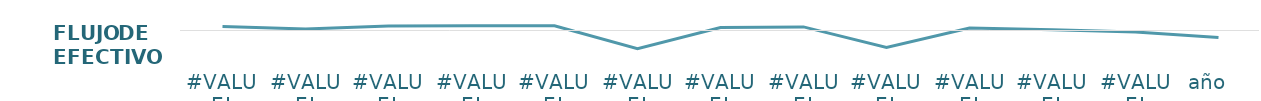
| Category | Flujo de efectivo |
|---|---|
| #VALUE! | 169 |
| #VALUE! | 69 |
| #VALUE! | 192 |
| #VALUE! | 199 |
| #VALUE! | 204 |
| #VALUE! | -771 |
| #VALUE! | 124 |
| #VALUE! | 154 |
| #VALUE! | -721 |
| #VALUE! | 109 |
| #VALUE! | 34 |
| #VALUE! | -61 |
| año   | -299 |